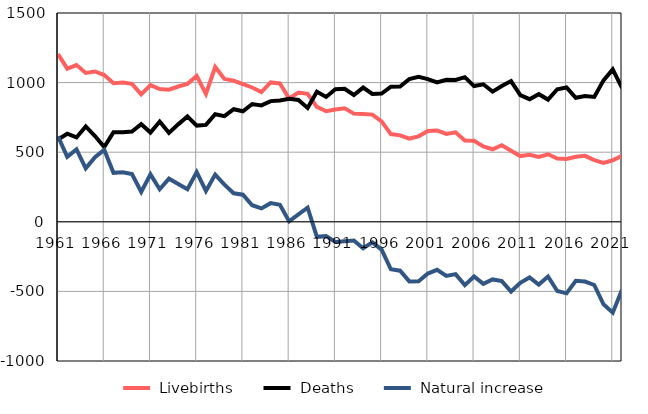
| Category |  Livebirths |  Deaths |  Natural increase |
|---|---|---|---|
| 1961.0 | 1205 | 591 | 614 |
| 1962.0 | 1100 | 633 | 467 |
| 1963.0 | 1126 | 606 | 520 |
| 1964.0 | 1069 | 685 | 384 |
| 1965.0 | 1080 | 616 | 464 |
| 1966.0 | 1054 | 537 | 517 |
| 1967.0 | 995 | 643 | 352 |
| 1968.0 | 1000 | 644 | 356 |
| 1969.0 | 991 | 648 | 343 |
| 1970.0 | 915 | 701 | 214 |
| 1971.0 | 982 | 641 | 341 |
| 1972.0 | 954 | 720 | 234 |
| 1973.0 | 949 | 639 | 310 |
| 1974.0 | 972 | 700 | 272 |
| 1975.0 | 991 | 757 | 234 |
| 1976.0 | 1048 | 691 | 357 |
| 1977.0 | 918 | 696 | 222 |
| 1978.0 | 1112 | 773 | 339 |
| 1979.0 | 1026 | 759 | 267 |
| 1980.0 | 1014 | 809 | 205 |
| 1981.0 | 989 | 794 | 195 |
| 1982.0 | 965 | 846 | 119 |
| 1983.0 | 932 | 836 | 96 |
| 1984.0 | 1001 | 867 | 134 |
| 1985.0 | 994 | 872 | 122 |
| 1986.0 | 886 | 883 | 3 |
| 1987.0 | 928 | 875 | 53 |
| 1988.0 | 919 | 818 | 101 |
| 1989.0 | 826 | 934 | -108 |
| 1990.0 | 794 | 897 | -103 |
| 1991.0 | 807 | 952 | -145 |
| 1992.0 | 815 | 955 | -140 |
| 1993.0 | 777 | 911 | -134 |
| 1994.0 | 774 | 964 | -190 |
| 1995.0 | 770 | 918 | -148 |
| 1996.0 | 721 | 921 | -200 |
| 1997.0 | 630 | 971 | -341 |
| 1998.0 | 621 | 972 | -351 |
| 1999.0 | 598 | 1026 | -428 |
| 2000.0 | 614 | 1041 | -427 |
| 2001.0 | 653 | 1025 | -372 |
| 2002.0 | 656 | 1001 | -345 |
| 2003.0 | 631 | 1020 | -389 |
| 2004.0 | 643 | 1019 | -376 |
| 2005.0 | 584 | 1039 | -455 |
| 2006.0 | 582 | 975 | -393 |
| 2007.0 | 542 | 988 | -446 |
| 2008.0 | 521 | 935 | -414 |
| 2009.0 | 550 | 976 | -426 |
| 2010.0 | 510 | 1011 | -501 |
| 2011.0 | 472 | 910 | -438 |
| 2012.0 | 481 | 881 | -400 |
| 2013.0 | 466 | 917 | -451 |
| 2014.0 | 485 | 878 | -393 |
| 2015.0 | 455 | 952 | -497 |
| 2016.0 | 451 | 965 | -514 |
| 2017.0 | 467 | 891 | -424 |
| 2018.0 | 474 | 903 | -429 |
| 2019.0 | 443 | 897 | -454 |
| 2020.0 | 423 | 1016 | -593 |
| 2021.0 | 442 | 1095 | -653 |
| 2022.0 | 474 | 962 | -488 |